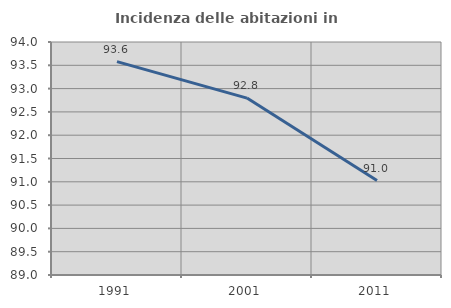
| Category | Incidenza delle abitazioni in proprietà  |
|---|---|
| 1991.0 | 93.578 |
| 2001.0 | 92.797 |
| 2011.0 | 91.026 |